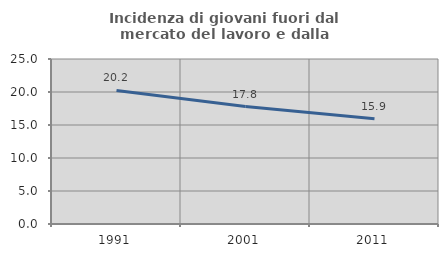
| Category | Incidenza di giovani fuori dal mercato del lavoro e dalla formazione  |
|---|---|
| 1991.0 | 20.24 |
| 2001.0 | 17.799 |
| 2011.0 | 15.931 |